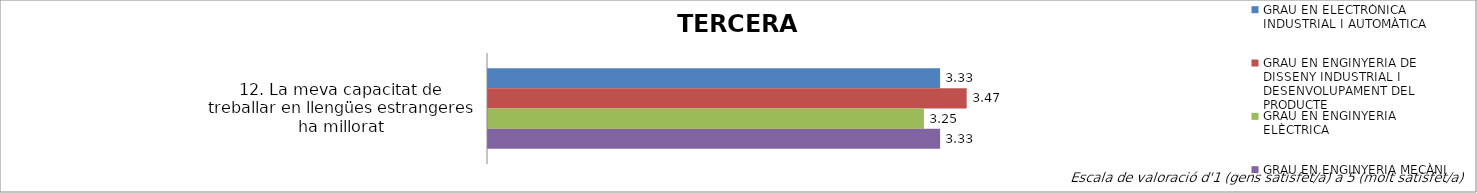
| Category | GRAU EN ELECTRÒNICA INDUSTRIAL I AUTOMÀTICA | GRAU EN ENGINYERIA DE DISSENY INDUSTRIAL I DESENVOLUPAMENT DEL PRODUCTE | GRAU EN ENGINYERIA ELÈCTRICA | GRAU EN ENGINYERIA MECÀNICA |
|---|---|---|---|---|
| 12. La meva capacitat de treballar en llengües estrangeres ha millorat | 3.333 | 3.471 | 3.25 | 3.333 |